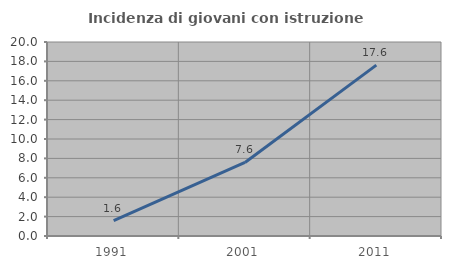
| Category | Incidenza di giovani con istruzione universitaria |
|---|---|
| 1991.0 | 1.596 |
| 2001.0 | 7.583 |
| 2011.0 | 17.617 |